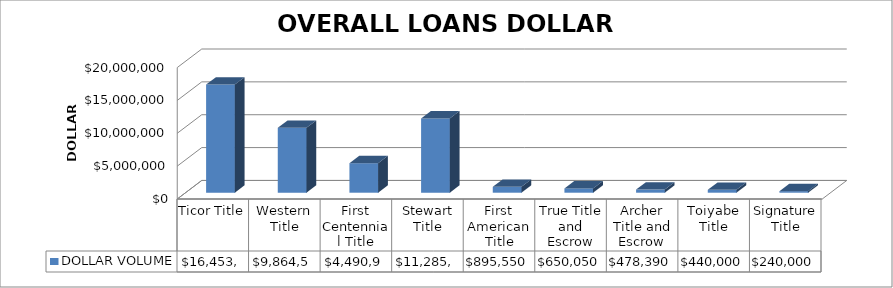
| Category | DOLLAR VOLUME |
|---|---|
| Ticor Title | 16453009 |
| Western Title | 9864570 |
| First Centennial Title | 4490987 |
| Stewart Title | 11285510 |
| First American Title | 895550 |
| True Title and Escrow | 650050 |
| Archer Title and Escrow | 478390 |
| Toiyabe Title | 440000 |
| Signature Title | 240000 |